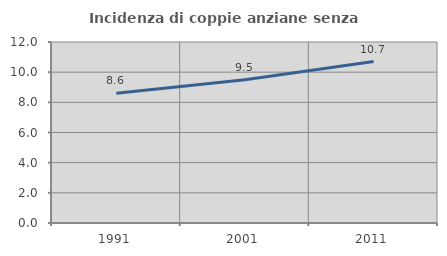
| Category | Incidenza di coppie anziane senza figli  |
|---|---|
| 1991.0 | 8.602 |
| 2001.0 | 9.494 |
| 2011.0 | 10.706 |